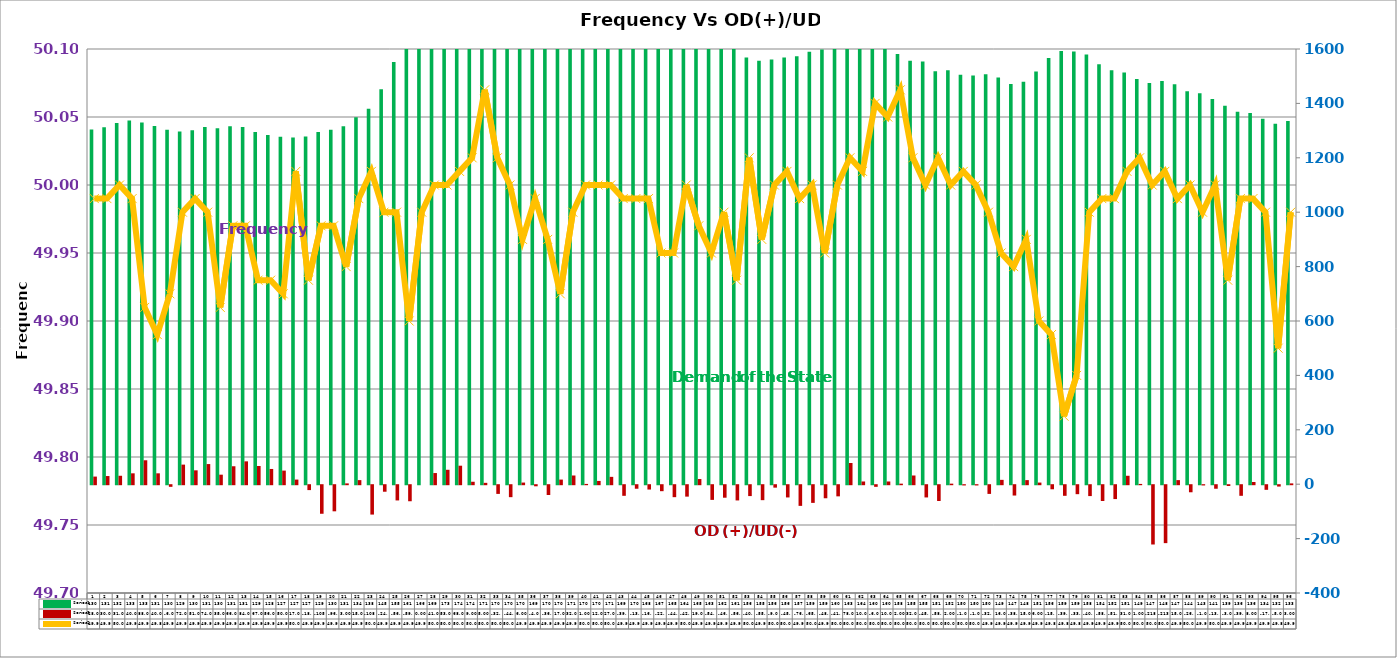
| Category | Series 2 | Series 4 |
|---|---|---|
| 0 | 1304 | 28 |
| 1 | 1312 | 30 |
| 2 | 1328 | 31 |
| 3 | 1337 | 40 |
| 4 | 1330 | 88 |
| 5 | 1317 | 40 |
| 6 | 1303 | -6 |
| 7 | 1297 | 72 |
| 8 | 1301 | 51 |
| 9 | 1313 | 74 |
| 10 | 1309 | 35 |
| 11 | 1316 | 66 |
| 12 | 1313 | 84 |
| 13 | 1295 | 67 |
| 14 | 1284 | 56 |
| 15 | 1277 | 50 |
| 16 | 1275 | 17 |
| 17 | 1278 | -18 |
| 18 | 1295 | -105 |
| 19 | 1303 | -96 |
| 20 | 1316 | 3 |
| 21 | 1349 | 15 |
| 22 | 1380 | -108 |
| 23 | 1452 | -24 |
| 24 | 1552 | -56 |
| 25 | 1610 | -59 |
| 26 | 1668 | 0 |
| 27 | 1694 | 41 |
| 28 | 1734 | 53 |
| 29 | 1748 | 68 |
| 30 | 1741 | 9 |
| 31 | 1710 | 5 |
| 32 | 1708 | -32 |
| 33 | 1707 | -44 |
| 34 | 1704 | 6 |
| 35 | 1692 | -4 |
| 36 | 1707 | -36 |
| 37 | 1708 | 17 |
| 38 | 1714 | 32 |
| 39 | 1703 | 1 |
| 40 | 1705 | 12 |
| 41 | 1711 | 27 |
| 42 | 1697 | -39 |
| 43 | 1706 | -13 |
| 44 | 1681 | -16 |
| 45 | 1675 | -22 |
| 46 | 1653 | -44 |
| 47 | 1647 | -42 |
| 48 | 1659 | 19 |
| 49 | 1630 | -54 |
| 50 | 1620 | -46 |
| 51 | 1614 | -56 |
| 52 | 1569 | -40 |
| 53 | 1557 | -55 |
| 54 | 1561 | -9 |
| 55 | 1569 | -45 |
| 56 | 1573 | -76 |
| 57 | 1590 | -65 |
| 58 | 1598 | -48 |
| 59 | 1601 | -41 |
| 60 | 1635 | 78 |
| 61 | 1647 | 10 |
| 62 | 1605 | -6 |
| 63 | 1603 | 10 |
| 64 | 1582 | 2 |
| 65 | 1557 | 32 |
| 66 | 1554 | -45 |
| 67 | 1518 | -58 |
| 68 | 1522 | 2 |
| 69 | 1505 | -1 |
| 70 | 1503 | -1 |
| 71 | 1507 | -32 |
| 72 | 1495 | 16 |
| 73 | 1471 | -38 |
| 74 | 1480 | 15 |
| 75 | 1517 | 6 |
| 76 | 1567 | -15 |
| 77 | 1593 | -39 |
| 78 | 1591 | -33 |
| 79 | 1580 | -40 |
| 80 | 1544 | -58 |
| 81 | 1522 | -51 |
| 82 | 1514 | 31 |
| 83 | 1490 | 1 |
| 84 | 1475 | -218 |
| 85 | 1482 | -213 |
| 86 | 1470 | 15 |
| 87 | 1445 | -26 |
| 88 | 1437 | -1 |
| 89 | 1416 | -13 |
| 90 | 1391 | -3 |
| 91 | 1369 | -39 |
| 92 | 1365 | 8 |
| 93 | 1344 | -17 |
| 94 | 1325 | -5 |
| 95 | 1335 | 3 |